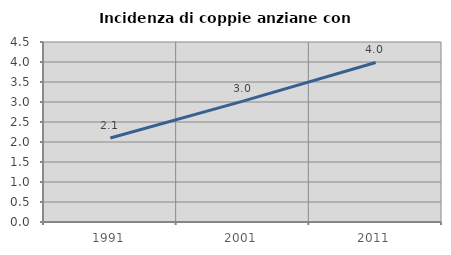
| Category | Incidenza di coppie anziane con figli |
|---|---|
| 1991.0 | 2.102 |
| 2001.0 | 3.022 |
| 2011.0 | 3.988 |